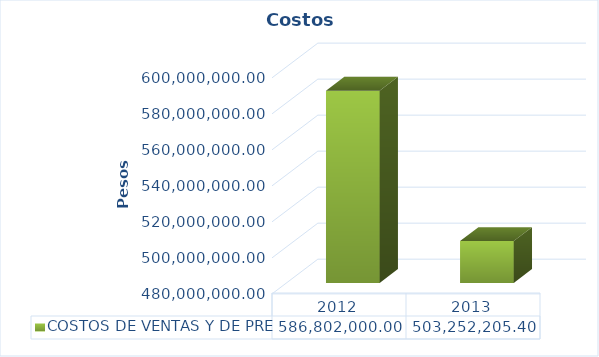
| Category | COSTOS DE VENTAS Y DE PRE |
|---|---|
| 2012 | 586802000 |
| 2013 | 503252205.4 |